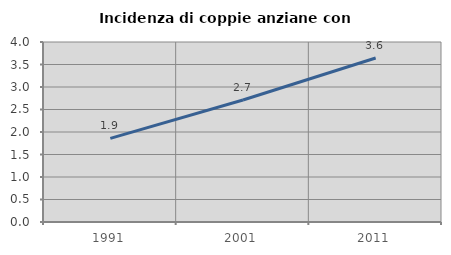
| Category | Incidenza di coppie anziane con figli |
|---|---|
| 1991.0 | 1.858 |
| 2001.0 | 2.71 |
| 2011.0 | 3.644 |